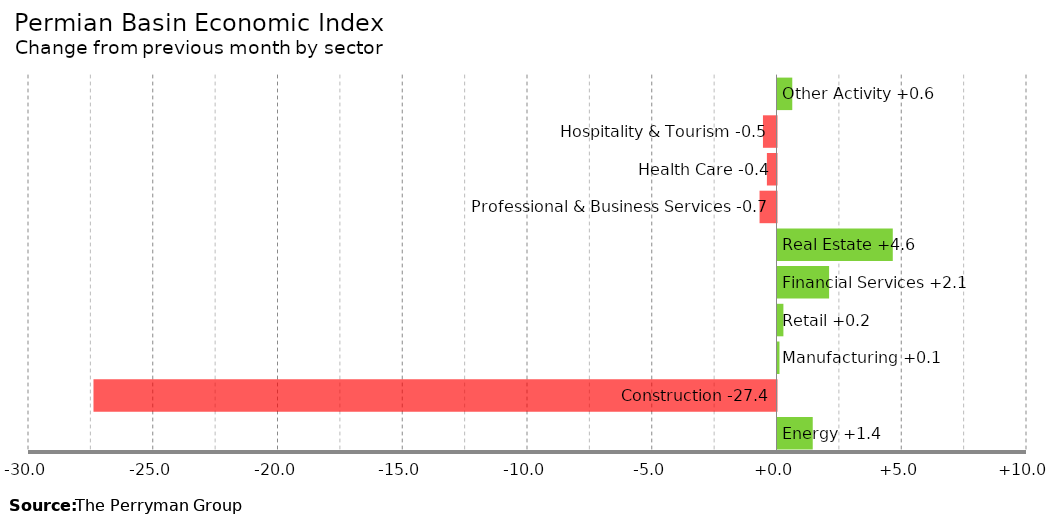
| Category | Change |
|---|---|
| Energy | 1.412 |
| Construction | -27.375 |
| Manufacturing | 0.079 |
| Retail | 0.237 |
| Financial Services | 2.068 |
| Real Estate | 4.621 |
| Professional & Business Services | -0.679 |
| Health Care | -0.385 |
| Hospitality & Tourism | -0.543 |
| Other Activity | 0.592 |